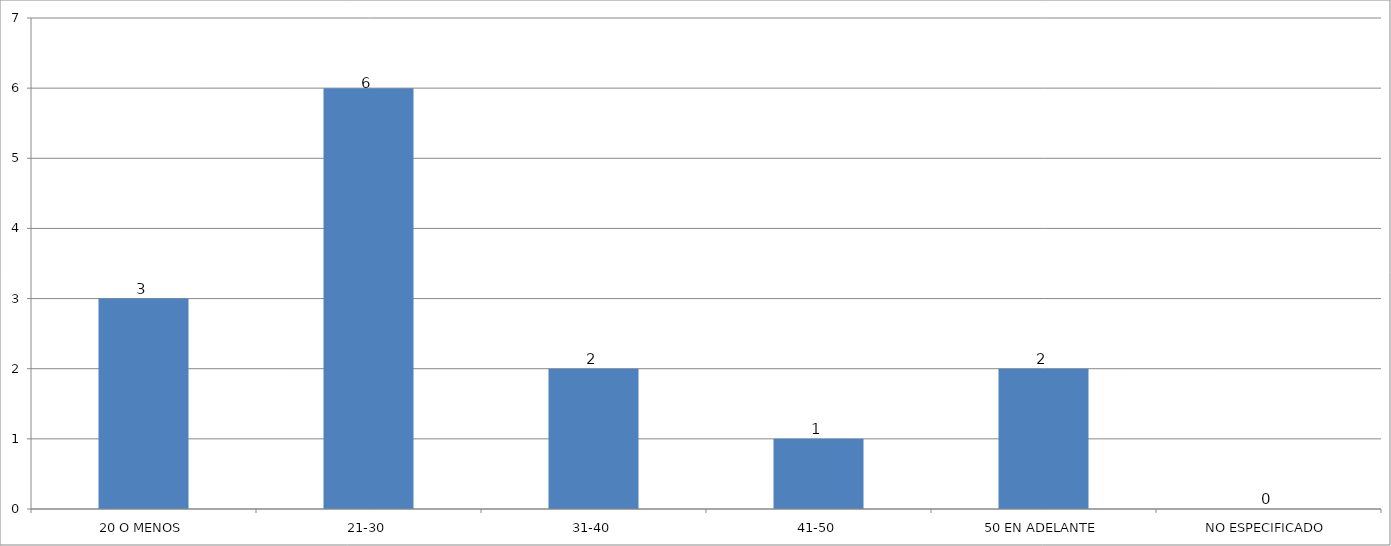
| Category | Series 0 |
|---|---|
| 20 O MENOS | 3 |
| 21-30 | 6 |
| 31-40 | 2 |
| 41-50 | 1 |
| 50 EN ADELANTE | 2 |
| NO ESPECIFICADO | 0 |